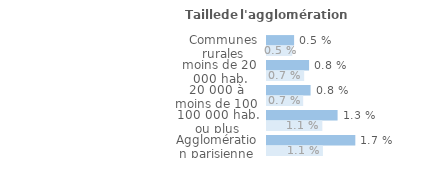
| Category | Proportion de victimes parmi les ménages possédant une voiture | Proportion de victimes parmi l'ensemble des ménages |
|---|---|---|
| Communes rurales | 0.005 | 0.005 |
| moins de 20 000 hab. | 0.008 | 0.007 |
| 20 000 à moins de 100 000 hab. | 0.008 | 0.007 |
| 100 000 hab. ou plus | 0.013 | 0.011 |
| Agglomération parisienne | 0.017 | 0.011 |